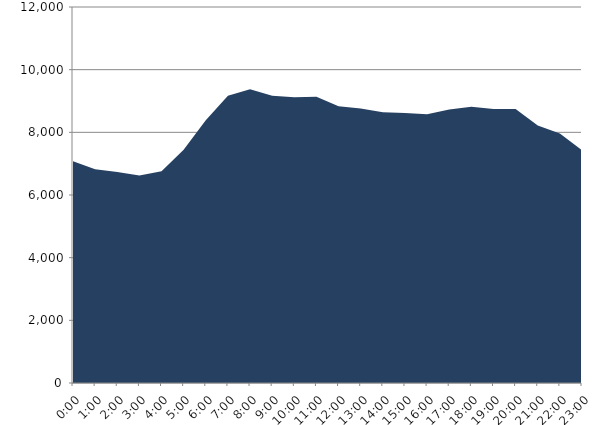
| Category | Series 0 | Series 1 |
|---|---|---|
| 2019-04-17 |  | 7076.83 |
| 2019-04-17 01:00:00 |  | 6817.82 |
| 2019-04-17 02:00:00 |  | 6732.93 |
| 2019-04-17 03:00:00 |  | 6620.33 |
| 2019-04-17 04:00:00 |  | 6759.12 |
| 2019-04-17 05:00:00 |  | 7441.73 |
| 2019-04-17 06:00:00 |  | 8383.9 |
| 2019-04-17 07:00:00 |  | 9164.4 |
| 2019-04-17 08:00:00 |  | 9374.1 |
| 2019-04-17 09:00:00 |  | 9164.87 |
| 2019-04-17 10:00:00 |  | 9115.98 |
| 2019-04-17 11:00:00 |  | 9133.06 |
| 2019-04-17 12:00:00 |  | 8833.96 |
| 2019-04-17 13:00:00 |  | 8760.32 |
| 2019-04-17 14:00:00 |  | 8641.73 |
| 2019-04-17 15:00:00 |  | 8613.28 |
| 2019-04-17 16:00:00 |  | 8573.81 |
| 2019-04-17 17:00:00 |  | 8725.48 |
| 2019-04-17 18:00:00 |  | 8818.43 |
| 2019-04-17 19:00:00 |  | 8742.69 |
| 2019-04-17 20:00:00 |  | 8745.36 |
| 2019-04-17 21:00:00 |  | 8221.63 |
| 2019-04-17 22:00:00 |  | 7958.93 |
| 2019-04-17 23:00:00 |  | 7431.77 |